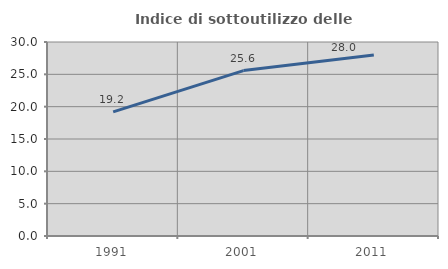
| Category | Indice di sottoutilizzo delle abitazioni  |
|---|---|
| 1991.0 | 19.191 |
| 2001.0 | 25.577 |
| 2011.0 | 27.996 |